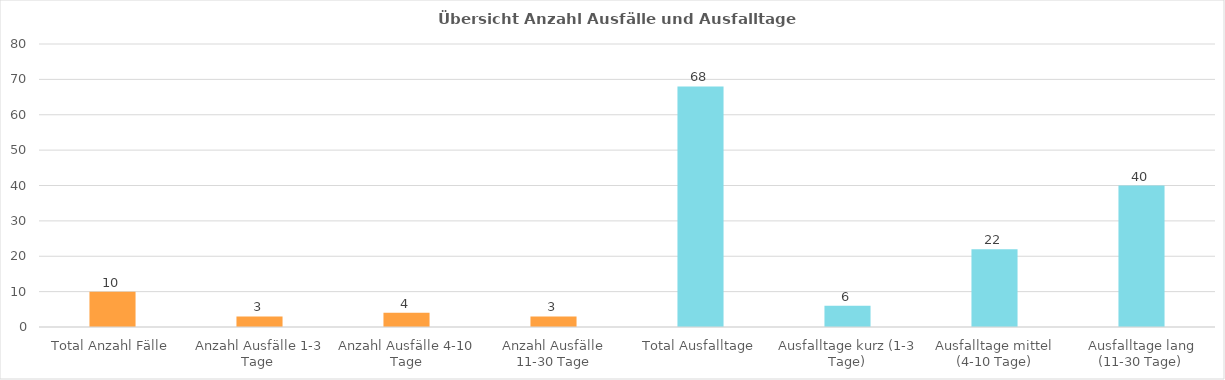
| Category | Gesamttotal |
|---|---|
| Total Anzahl Fälle | 10 |
| Anzahl Ausfälle 1-3 Tage  | 3 |
| Anzahl Ausfälle 4-10 Tage | 4 |
| Anzahl Ausfälle 11-30 Tage | 3 |
| Total Ausfalltage | 68 |
| Ausfalltage kurz (1-3 Tage) | 6 |
| Ausfalltage mittel (4-10 Tage) | 22 |
| Ausfalltage lang (11-30 Tage) | 40 |